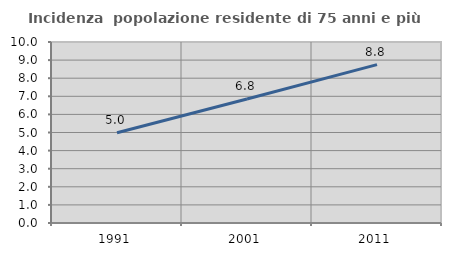
| Category | Incidenza  popolazione residente di 75 anni e più |
|---|---|
| 1991.0 | 4.984 |
| 2001.0 | 6.848 |
| 2011.0 | 8.751 |